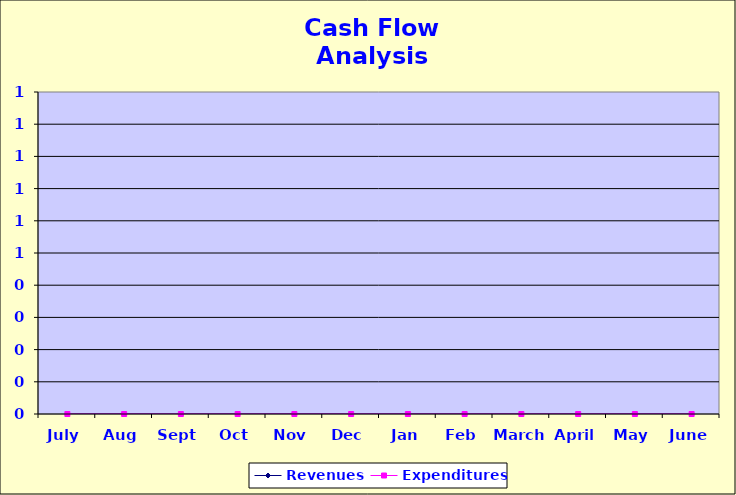
| Category | Revenues | Expenditures |
|---|---|---|
| July | 0 | 0 |
| Aug | 0 | 0 |
| Sept | 0 | 0 |
| Oct | 0 | 0 |
| Nov | 0 | 0 |
| Dec | 0 | 0 |
| Jan | 0 | 0 |
| Feb | 0 | 0 |
| March | 0 | 0 |
| April | 0 | 0 |
| May | 0 | 0 |
| June | 0 | 0 |